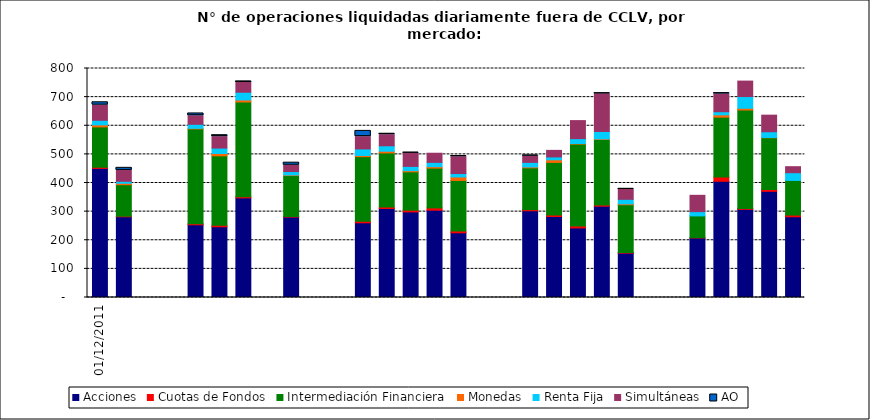
| Category | Acciones | Cuotas de Fondos | Intermediación Financiera | Monedas | Renta Fija | Simultáneas | AO |
|---|---|---|---|---|---|---|---|
| 01/12/2011 | 451 | 4 | 141 | 7 | 16 | 53 | 10 |
| 02/12/2011 | 282 | 2 | 110 | 5 | 7 | 38 | 9 |
| 05/12/2011 | 254 | 4 | 331 | 2 | 14 | 30 | 8 |
| 06/12/2011 | 247 | 5 | 243 | 8 | 19 | 40 | 5 |
| 07/12/2011 | 348 | 4 | 331 | 7 | 27 | 34 | 4 |
| 09/12/2011 | 281 | 2 | 143 | 2 | 12 | 22 | 9 |
| 12/12/2011 | 261 | 5 | 226 | 4 | 23 | 43 | 20 |
| 13/12/2011 | 311 | 5 | 189 | 6 | 19 | 39 | 3 |
| 14/12/2011 | 299 | 6 | 134 | 4 | 15 | 46 | 2 |
| 15/12/2011 | 305 | 8 | 139 | 5 | 15 | 32 | 0 |
| 16/12/2011 | 226 | 6 | 177 | 12 | 12 | 59 | 2 |
| 19/12/2011 | 303 | 4 | 146 | 3 | 16 | 22 | 2 |
| 20/12/2011 | 283 | 5 | 184 | 9 | 10 | 23 | 0 |
| 21/12/2011 | 243 | 7 | 286 | 2 | 17 | 63 | 0 |
| 22/12/2011 | 319 | 4 | 229 | 2 | 26 | 132 | 1 |
| 23/12/2011 | 155 | 2 | 167 | 3 | 16 | 35 | 1 |
| 26/12/2011 | 208 | 1 | 76 | 0 | 15 | 57 | 0 |
| 27/12/2011 | 406 | 15 | 209 | 8 | 11 | 62 | 3 |
| 28/12/2011 | 308 | 3 | 344 | 6 | 41 | 54 | 0 |
| 29/12/2011 | 371 | 6 | 181 | 1 | 20 | 58 | 0 |
| 30/12/2011 | 282 | 6 | 121 | 0 | 27 | 21 | 0 |